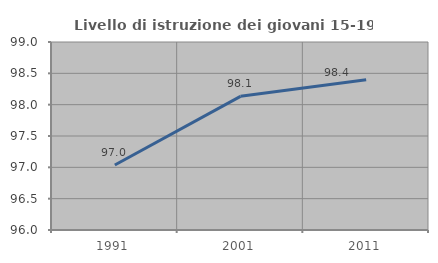
| Category | Livello di istruzione dei giovani 15-19 anni |
|---|---|
| 1991.0 | 97.037 |
| 2001.0 | 98.133 |
| 2011.0 | 98.397 |